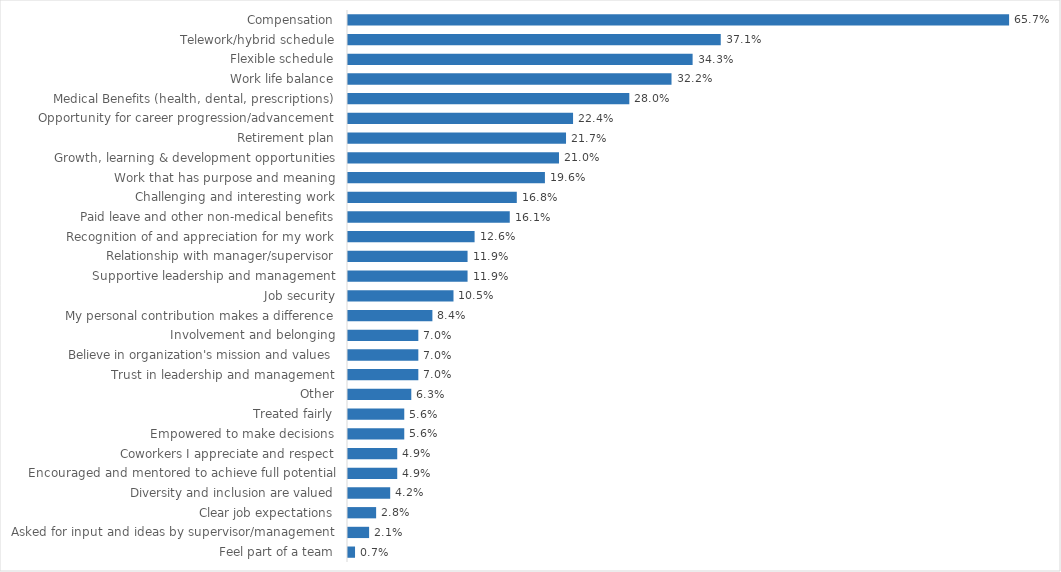
| Category | Taxes |
|---|---|
| Compensation | 0.657 |
| Telework/hybrid schedule | 0.371 |
| Flexible schedule | 0.343 |
| Work life balance | 0.322 |
| Medical Benefits (health, dental, prescriptions) | 0.28 |
| Opportunity for career progression/advancement | 0.224 |
| Retirement plan | 0.217 |
| Growth, learning & development opportunities | 0.21 |
| Work that has purpose and meaning | 0.196 |
| Challenging and interesting work | 0.168 |
| Paid leave and other non-medical benefits | 0.161 |
| Recognition of and appreciation for my work | 0.126 |
| Relationship with manager/supervisor | 0.119 |
| Supportive leadership and management | 0.119 |
| Job security | 0.105 |
| My personal contribution makes a difference | 0.084 |
| Involvement and belonging | 0.07 |
| Believe in organization's mission and values | 0.07 |
| Trust in leadership and management | 0.07 |
| Other | 0.063 |
| Treated fairly | 0.056 |
| Empowered to make decisions | 0.056 |
| Coworkers I appreciate and respect | 0.049 |
| Encouraged and mentored to achieve full potential | 0.049 |
| Diversity and inclusion are valued | 0.042 |
| Clear job expectations | 0.028 |
| Asked for input and ideas by supervisor/management | 0.021 |
| Feel part of a team | 0.007 |